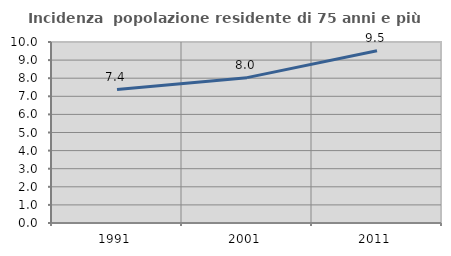
| Category | Incidenza  popolazione residente di 75 anni e più |
|---|---|
| 1991.0 | 7.374 |
| 2001.0 | 8.03 |
| 2011.0 | 9.516 |